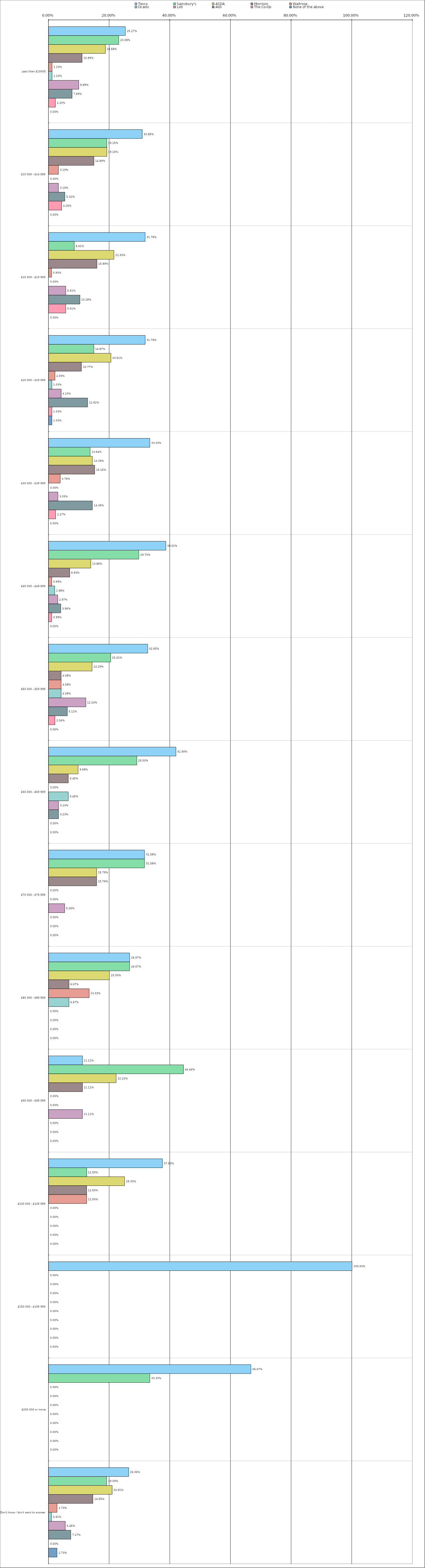
| Category | Tesco | Sainsbury's | ASDA | Morrison | Waitrose | Ocado | Lidl | Aldi | The Co-Op | None of the above |
|---|---|---|---|---|---|---|---|---|---|---|
| 0 | 0.253 | 0.231 | 0.187 | 0.11 | 0.011 | 0.011 | 0.099 | 0.077 | 0.022 | 0 |
| 1 | 0.308 | 0.192 | 0.192 | 0.149 | 0.032 | 0 | 0.032 | 0.053 | 0.043 | 0 |
| 2 | 0.318 | 0.084 | 0.215 | 0.159 | 0.009 | 0 | 0.056 | 0.103 | 0.056 | 0 |
| 3 | 0.318 | 0.149 | 0.205 | 0.108 | 0.02 | 0.01 | 0.041 | 0.128 | 0.01 | 0.01 |
| 4 | 0.333 | 0.136 | 0.144 | 0.152 | 0.038 | 0 | 0.03 | 0.144 | 0.023 | 0 |
| 5 | 0.386 | 0.297 | 0.139 | 0.069 | 0.01 | 0.02 | 0.03 | 0.04 | 0.01 | 0 |
| 6 | 0.326 | 0.204 | 0.143 | 0.041 | 0.041 | 0.041 | 0.122 | 0.061 | 0.02 | 0 |
| 7 | 0.419 | 0.29 | 0.097 | 0.064 | 0 | 0.064 | 0.032 | 0.032 | 0 | 0 |
| 8 | 0.316 | 0.316 | 0.158 | 0.158 | 0 | 0 | 0.053 | 0 | 0 | 0 |
| 9 | 0.267 | 0.267 | 0.2 | 0.067 | 0.133 | 0.067 | 0 | 0 | 0 | 0 |
| 10 | 0.111 | 0.444 | 0.222 | 0.111 | 0 | 0 | 0.111 | 0 | 0 | 0 |
| 11 | 0.375 | 0.125 | 0.25 | 0.125 | 0.125 | 0 | 0 | 0 | 0 | 0 |
| 12 | 1 | 0 | 0 | 0 | 0 | 0 | 0 | 0 | 0 | 0 |
| 13 | 0.667 | 0.333 | 0 | 0 | 0 | 0 | 0 | 0 | 0 | 0 |
| 14 | 0.264 | 0.191 | 0.209 | 0.146 | 0.027 | 0.009 | 0.054 | 0.073 | 0 | 0.027 |